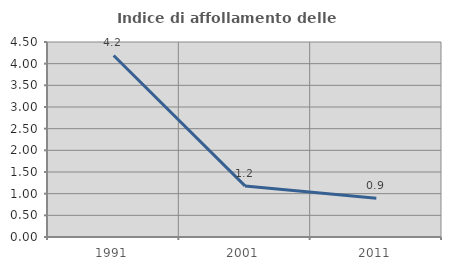
| Category | Indice di affollamento delle abitazioni  |
|---|---|
| 1991.0 | 4.189 |
| 2001.0 | 1.179 |
| 2011.0 | 0.895 |